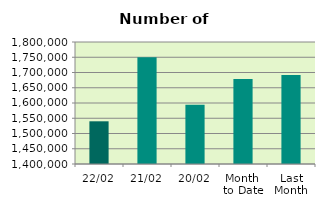
| Category | Series 0 |
|---|---|
| 22/02 | 1539988 |
| 21/02 | 1750182 |
| 20/02 | 1593924 |
| Month 
to Date | 1678574.125 |
| Last
Month | 1692009 |